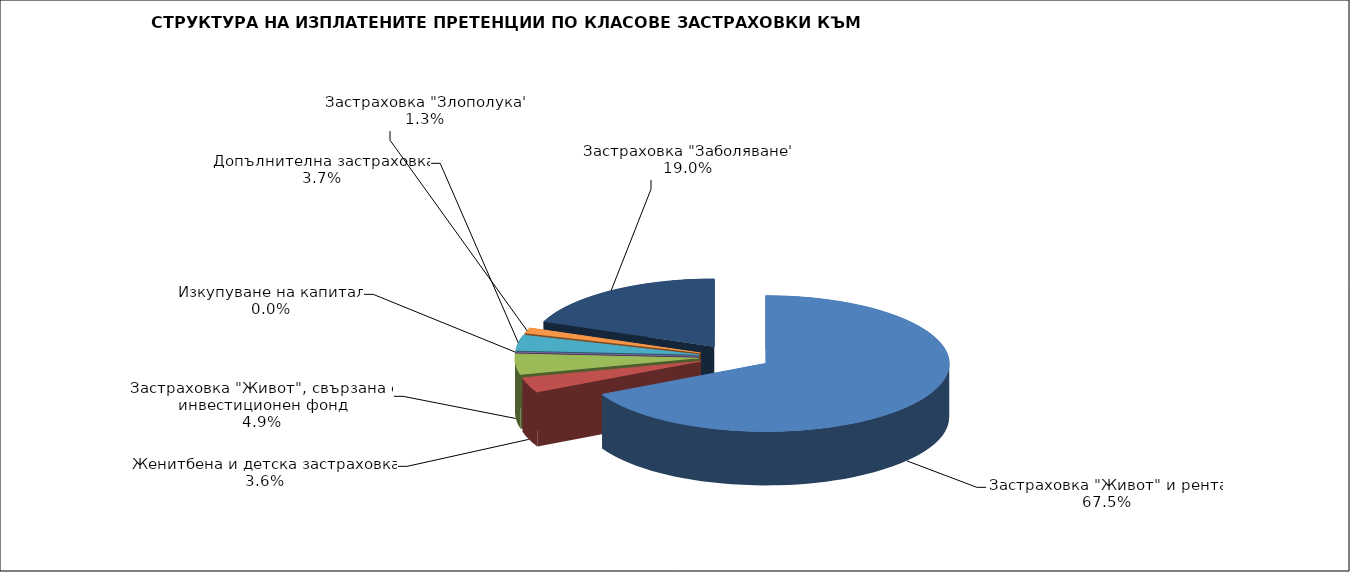
| Category | 16 251 719 |
|---|---|
| Застраховка "Живот" и рента | 16251718.747 |
| Женитбена и детска застраховка | 873569.776 |
| Застраховка "Живот", свързана с инвестиционен фонд | 1177599.865 |
| Изкупуване на капитал | 0 |
| Допълнителна застраховка | 888605.432 |
| Застраховка "Злополука" | 319797.58 |
| Застраховка "Заболяване" | 4576843.279 |